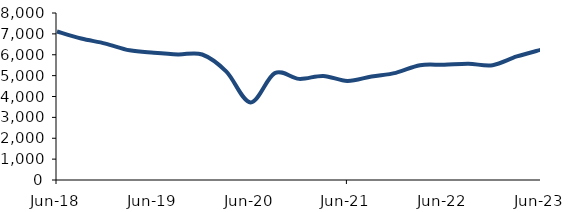
| Category | Series 0 |
|---|---|
| 2018-06-01 | 7112.476 |
| 2018-09-01 | 6776.144 |
| 2018-12-01 | 6534.66 |
| 2019-03-01 | 6213.616 |
| 2019-06-01 | 6096.222 |
| 2019-09-01 | 6016.865 |
| 2019-12-01 | 6012.043 |
| 2020-03-01 | 5191.607 |
| 2020-06-01 | 3716.886 |
| 2020-09-01 | 5119.982 |
| 2020-12-01 | 4844.247 |
| 2021-03-01 | 4985.391 |
| 2021-06-01 | 4744.91 |
| 2021-09-01 | 4960.054 |
| 2021-12-01 | 5134.028 |
| 2022-03-01 | 5499.63 |
| 2022-06-01 | 5520.73 |
| 2022-09-01 | 5569.559 |
| 2022-12-01 | 5500.282 |
| 2023-03-01 | 5917.845 |
| 2023-06-01 | 6242.208 |